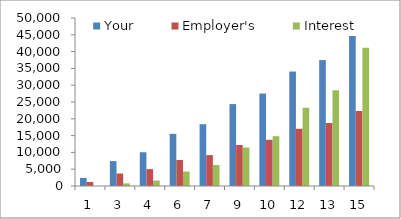
| Category | Your | Employer's | Interest |
|---|---|---|---|
| 1.0 | 2400 | 1200 | 0 |
| 3.0 | 7418.16 | 3709.08 | 781.2 |
| 4.0 | 10040.705 | 5020.352 | 1614.791 |
| 6.0 | 15524.184 | 7762.092 | 4314.749 |
| 7.0 | 18389.909 | 9194.955 | 6246.821 |
| 9.0 | 24381.855 | 12190.927 | 11458.961 |
| 10.0 | 27513.31 | 13756.655 | 14821.182 |
| 12.0 | 34060.871 | 17030.435 | 23287.457 |
| 13.0 | 37482.697 | 18741.349 | 28493.97 |
| 15.0 | 44637.393 | 22318.697 | 41139.681 |